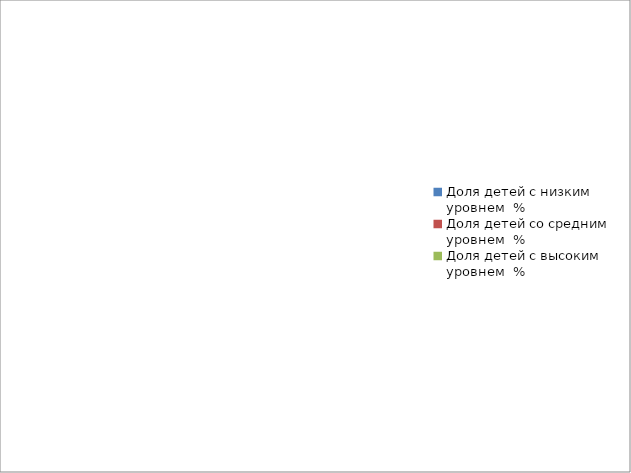
| Category | Series 0 |
|---|---|
| Доля детей с низким уровнем  % | 0 |
| Доля детей со средним уровнем  % | 0 |
| Доля детей с высоким уровнем  % | 0 |